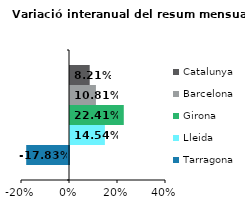
| Category | Tarragona | Lleida | Girona | Barcelona | Catalunya |
|---|---|---|---|---|---|
| 0 | -0.178 | 0.145 | 0.224 | 0.108 | 0.082 |